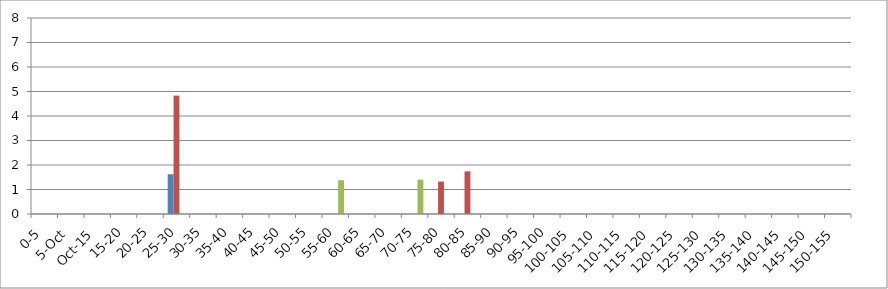
| Category | 119875 | 146067 | 241240 |
|---|---|---|---|
| 0-5 | 0 | 0 | 0 |
| 5-Oct | 0 | 0 | 0 |
| Oct-15 | 0 | 0 | 0 |
| 15-20 | 0 | 0 | 0 |
| 20-25 | 0 | 0 | 0 |
| 25-30 | 1.621 | 4.832 | 0 |
| 30-35 | 0 | 0 | 0 |
| 35-40 | 0 | 0 | 0 |
| 40-45 | 0 | 0 | 0 |
| 45-50 | 0 | 0 | 0 |
| 50-55 | 0 | 0 | 0 |
| 55-60 | 0 | 0 | 1.379 |
| 60-65 | 0 | 0 | 0 |
| 65-70 | 0 | 0 | 0 |
| 70-75 | 0 | 0 | 1.402 |
| 75-80 | 0 | 1.325 | 0 |
| 80-85 | 0 | 1.741 | 0 |
| 85-90 | 0 | 0 | 0 |
| 90-95 | 0 | 0 | 0 |
| 95-100 | 0 | 0 | 0 |
| 100-105 | 0 | 0 | 0 |
| 105-110 | 0 | 0 | 0 |
| 110-115 | 0 | 0 | 0 |
| 115-120 | 0 | 0 | 0 |
| 120-125 | 0 | 0 | 0 |
| 125-130 | 0 | 0 | 0 |
| 130-135 | 0 | 0 | 0 |
| 135-140 | 0 | 0 | 0 |
| 140-145 | 0 | 0 | 0 |
| 145-150 | 0 | 0 | 0 |
| 150-155 | 0 | 0 | 0 |